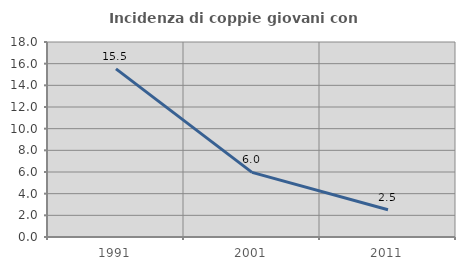
| Category | Incidenza di coppie giovani con figli |
|---|---|
| 1991.0 | 15.517 |
| 2001.0 | 5.97 |
| 2011.0 | 2.516 |